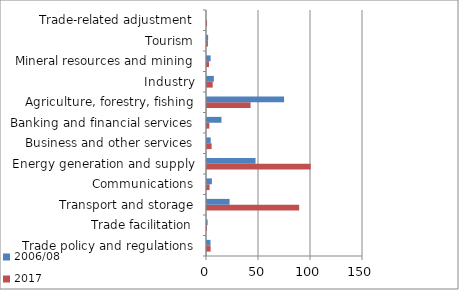
| Category | 2017 | 2006/08 |
|---|---|---|
| Trade policy and regulations | 3.477 | 3.364 |
| Trade facilitation | 0.006 | 0.631 |
| Transport and storage | 88.611 | 21.711 |
| Communications | 2.472 | 4.703 |
| Energy generation and supply | 99.674 | 46.667 |
| Business and other services | 4.437 | 3.55 |
| Banking and financial services | 2.251 | 13.914 |
| Agriculture, forestry, fishing | 41.895 | 74.109 |
| Industry | 5.473 | 6.586 |
| Mineral resources and mining | 1.925 | 3.48 |
| Tourism | 0.872 | 1.096 |
| Trade-related adjustment | 0.07 | 0 |